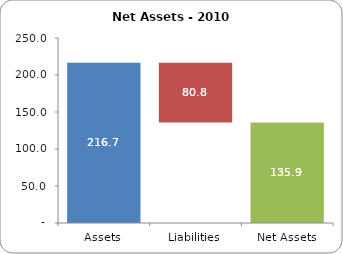
| Category | Series 0 | Series 1 |
|---|---|---|
| Assets | 0 | 216.72 |
| Liabilities | 135.919 | 80.801 |
| Net Assets | 0 | 135.919 |